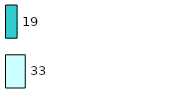
| Category | Series 0 | Series 1 |
|---|---|---|
| 0 | 33 | 19 |